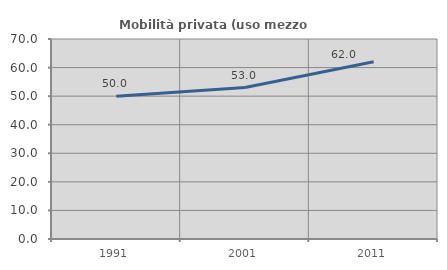
| Category | Mobilità privata (uso mezzo privato) |
|---|---|
| 1991.0 | 50 |
| 2001.0 | 53.009 |
| 2011.0 | 62.013 |